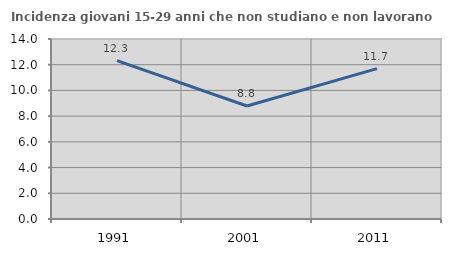
| Category | Incidenza giovani 15-29 anni che non studiano e non lavorano  |
|---|---|
| 1991.0 | 12.319 |
| 2001.0 | 8.789 |
| 2011.0 | 11.692 |